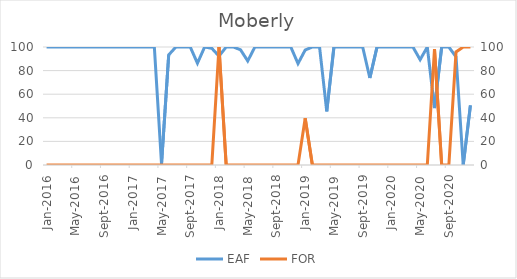
| Category | EAF |
|---|---|
| 2016-01-01 | 100 |
| 2016-02-01 | 100 |
| 2016-03-01 | 100 |
| 2016-04-01 | 100 |
| 2016-05-01 | 100 |
| 2016-06-01 | 100 |
| 2016-07-01 | 100 |
| 2016-08-01 | 100 |
| 2016-09-01 | 100 |
| 2016-10-01 | 100 |
| 2016-11-01 | 100 |
| 2016-12-01 | 100 |
| 2017-01-01 | 100 |
| 2017-02-01 | 100 |
| 2017-03-01 | 100 |
| 2017-04-01 | 100 |
| 2017-05-01 | 0.94 |
| 2017-06-01 | 93.34 |
| 2017-07-01 | 100 |
| 2017-08-01 | 100 |
| 2017-09-01 | 100 |
| 2017-10-01 | 86.25 |
| 2017-11-01 | 100 |
| 2017-12-01 | 98.88 |
| 2018-01-01 | 92.27 |
| 2018-02-01 | 100 |
| 2018-03-01 | 100 |
| 2018-04-01 | 97.64 |
| 2018-05-01 | 88.17 |
| 2018-06-01 | 100 |
| 2018-07-01 | 100 |
| 2018-08-01 | 100 |
| 2018-09-01 | 100 |
| 2018-10-01 | 100 |
| 2018-11-01 | 100 |
| 2018-12-01 | 85.94 |
| 2019-01-01 | 97.44 |
| 2019-02-01 | 100 |
| 2019-03-01 | 100 |
| 2019-04-01 | 45.42 |
| 2019-05-01 | 100 |
| 2019-06-01 | 100 |
| 2019-07-01 | 100 |
| 2019-08-01 | 100 |
| 2019-09-01 | 100 |
| 2019-10-01 | 73.72 |
| 2019-11-01 | 100 |
| 2019-12-01 | 100 |
| 2020-01-01 | 100 |
| 2020-02-01 | 100 |
| 2020-03-01 | 100 |
| 2020-04-01 | 100 |
| 2020-05-01 | 89.25 |
| 2020-06-01 | 100 |
| 2020-07-01 | 48.25 |
| 2020-08-01 | 100 |
| 2020-09-01 | 100 |
| 2020-10-01 | 91.73 |
| 2020-11-01 | 0 |
| 2020-12-01 | 50.54 |